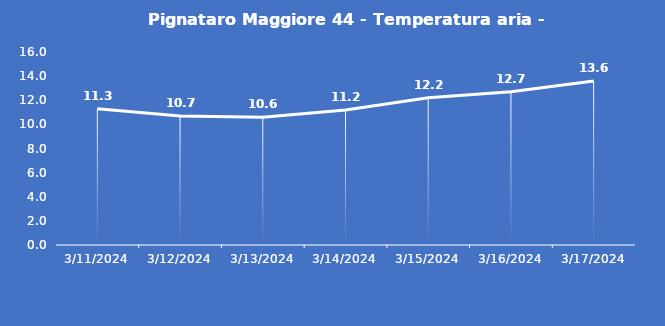
| Category | Pignataro Maggiore 44 - Temperatura aria - Grezzo (°C) |
|---|---|
| 3/11/24 | 11.3 |
| 3/12/24 | 10.7 |
| 3/13/24 | 10.6 |
| 3/14/24 | 11.2 |
| 3/15/24 | 12.2 |
| 3/16/24 | 12.7 |
| 3/17/24 | 13.6 |